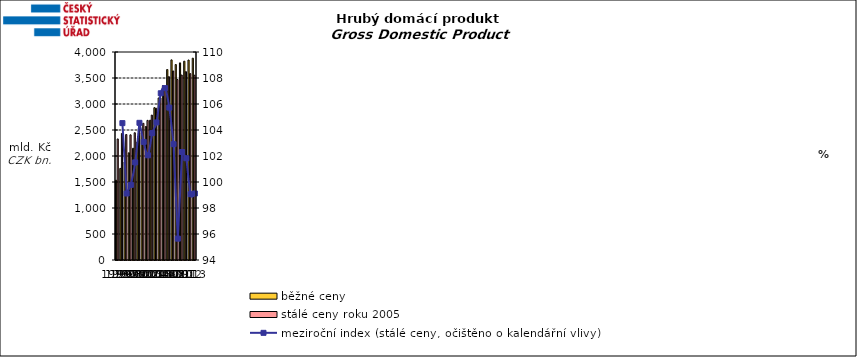
| Category | běžné ceny
 | stálé ceny roku 2005
 |
|---|---|---|
| 1995 | 1533.676 | 2328.028 |
| 1996 | 1761.575 | 2433.713 |
| 1997 | 1884.924 | 2412.965 |
| 1998 | 2061.583 | 2407.271 |
| 1999 | 2149.023 | 2447.696 |
| 2000 | 2269.695 | 2550.148 |
| 2001 | 2448.557 | 2629.135 |
| 2002 | 2567.53 | 2685.643 |
| 2003 | 2688.107 | 2786.789 |
| 2004 | 2929.172 | 2918.955 |
| 2005 | 3116.056 | 3116.056 |
| 2006 | 3352.599 | 3334.815 |
| 2007 | 3662.573 | 3526.071 |
| 2008 | 3848.411 | 3635.344 |
| 2009 | 3758.979 | 3471.494 |
| 2010 | 3790.88 | 3557.216 |
| 2011 | 3823.401 | 3621.908 |
| 2012 | 3845.926 | 3584.924 |
| 2013 | 3881.085 | 3553.645 |